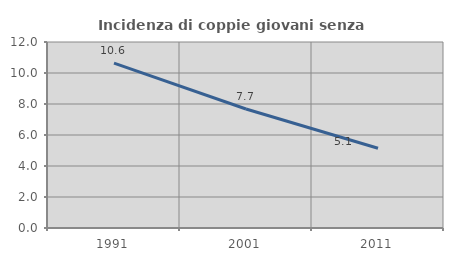
| Category | Incidenza di coppie giovani senza figli |
|---|---|
| 1991.0 | 10.634 |
| 2001.0 | 7.678 |
| 2011.0 | 5.147 |